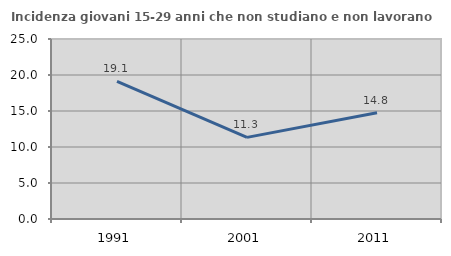
| Category | Incidenza giovani 15-29 anni che non studiano e non lavorano  |
|---|---|
| 1991.0 | 19.119 |
| 2001.0 | 11.34 |
| 2011.0 | 14.753 |